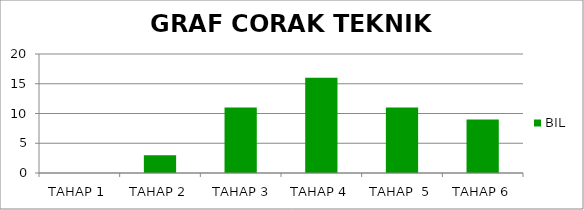
| Category | BIL |
|---|---|
| TAHAP 1 | 0 |
| TAHAP 2 | 3 |
|  TAHAP 3 | 11 |
| TAHAP 4 | 16 |
| TAHAP  5 | 11 |
| TAHAP 6 | 9 |